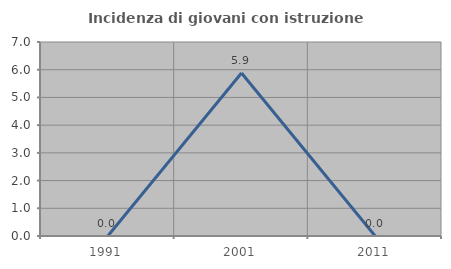
| Category | Incidenza di giovani con istruzione universitaria |
|---|---|
| 1991.0 | 0 |
| 2001.0 | 5.882 |
| 2011.0 | 0 |